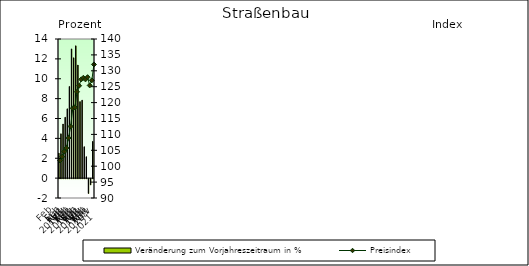
| Category | Veränderung zum Vorjahreszeitraum in % |
|---|---|
| 0 | 2.518 |
| 1 | 4.462 |
| 2 | 5.444 |
| 3 | 6.124 |
| 4 | 6.974 |
| 5 | 9.223 |
| 6 | 13.002 |
| 7 | 12.11 |
| 8 | 13.315 |
| 9 | 11.378 |
| 10 | 7.699 |
| 11 | 7.848 |
| 12 | 3.16 |
| 13 | 2.155 |
| 14 | -1.493 |
| 15 | -0.626 |
| 16 | 3.692 |